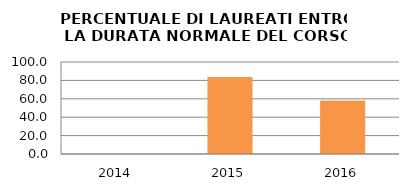
| Category | 2014 2015 2016 |
|---|---|
| 2014.0 | 0 |
| 2015.0 | 83.696 |
| 2016.0 | 58.14 |